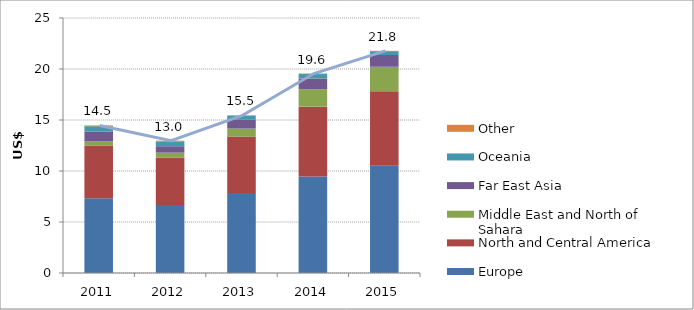
| Category | Europe | North and Central America | Middle East and North of Sahara | Far East Asia | Oceania | Other |
|---|---|---|---|---|---|---|
| 2011.0 | 7.322 | 5.176 | 0.401 | 0.968 | 0.524 | 0.078 |
| 2012.0 | 6.666 | 4.661 | 0.472 | 0.63 | 0.482 | 0.062 |
| 2013.0 | 7.838 | 5.541 | 0.778 | 0.904 | 0.383 | 0.007 |
| 2014.0 | 9.454 | 6.853 | 1.713 | 1.04 | 0.444 | 0.054 |
| 2015.0 | 10.525 | 7.297 | 2.397 | 1.151 | 0.377 | 0.036 |